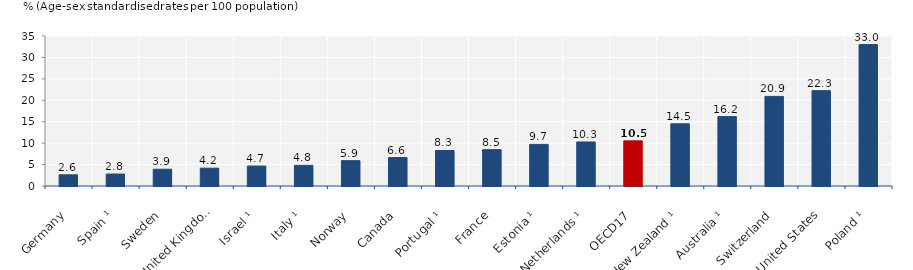
| Category | 2016 |
|---|---|
| Germany | 2.609 |
| Spain ¹ | 2.793 |
| Sweden | 3.91 |
| United Kingdom | 4.161 |
| Israel ¹ | 4.656 |
| Italy ¹ | 4.824 |
| Norway | 5.911 |
| Canada | 6.643 |
| Portugal ¹ | 8.288 |
| France | 8.477 |
| Estonia ¹ | 9.717 |
| Netherlands ¹ | 10.274 |
| OECD17 | 10.537 |
| New Zealand ¹ | 14.513 |
| Australia ¹ | 16.188 |
| Switzerland | 20.908 |
| United States | 22.253 |
| Poland ¹ | 33.003 |